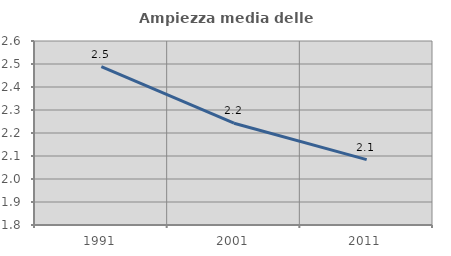
| Category | Ampiezza media delle famiglie |
|---|---|
| 1991.0 | 2.489 |
| 2001.0 | 2.243 |
| 2011.0 | 2.084 |